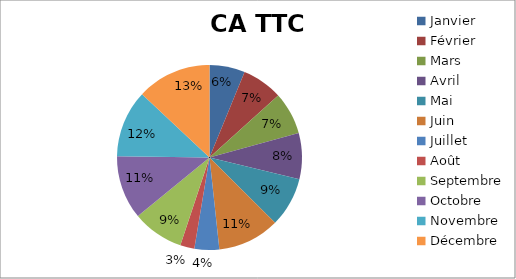
| Category | CA TTC |
|---|---|
| Janvier | 2000 |
| Février | 2300 |
| Mars | 2400 |
| Avril | 2600 |
| Mai | 2800 |
| Juin | 3500 |
| Juillet | 1400 |
| Août | 800 |
| Septembre | 2900 |
| Octobre | 3600 |
| Novembre | 3800 |
| Décembre | 4200 |